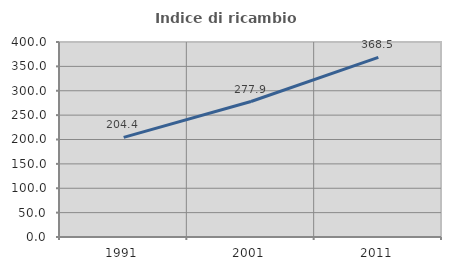
| Category | Indice di ricambio occupazionale  |
|---|---|
| 1991.0 | 204.425 |
| 2001.0 | 277.922 |
| 2011.0 | 368.493 |